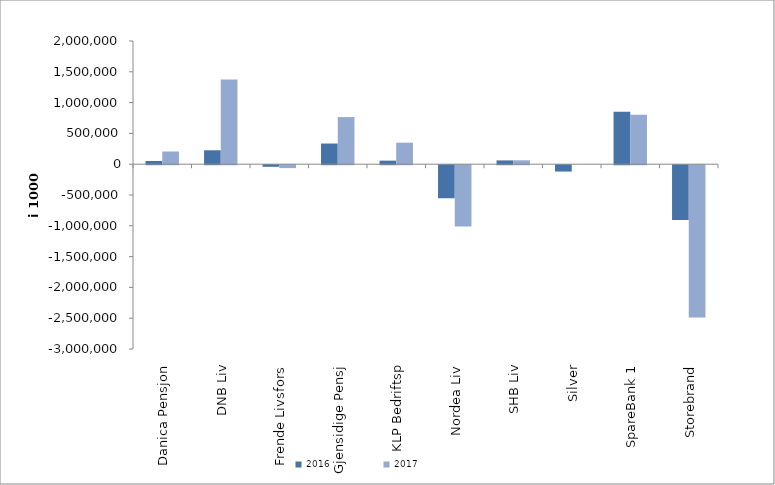
| Category | 2016 | 2017 |
|---|---|---|
| 0 | 52563.202 | 206271.342 |
| 1 | 225817 | 1374998 |
| 2 | -25788.044 | -46922 |
| 3 | 335536.562 | 764744.393 |
| 4 | 57815 | 349100 |
| 5 | -536369.096 | -993310.38 |
| 6 | 61517 | 63074 |
| 7 | -103175 | 0 |
| 8 | 853472.123 | 802761.499 |
| 9 | -890405.827 | -2471418.961 |